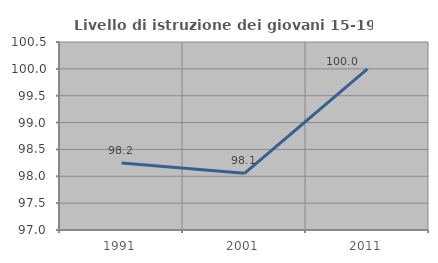
| Category | Livello di istruzione dei giovani 15-19 anni |
|---|---|
| 1991.0 | 98.246 |
| 2001.0 | 98.054 |
| 2011.0 | 100 |